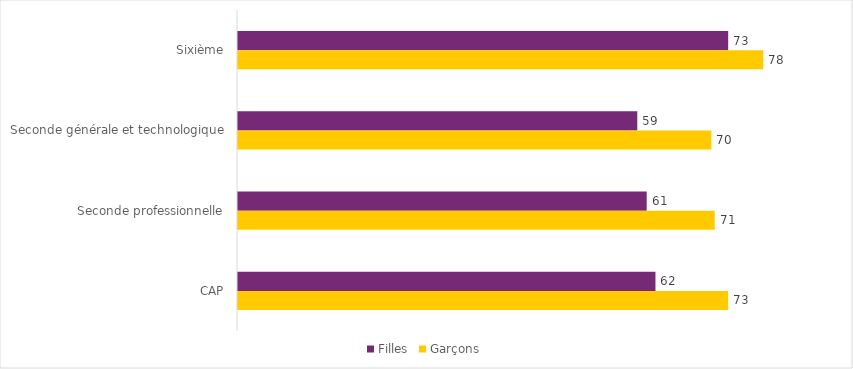
| Category | Filles | Garçons |
|---|---|---|
| Sixième | 72.8 | 78 |
| Seconde générale et technologique | 59.3 | 70.3 |
| Seconde professionnelle | 60.7 | 70.8 |
| CAP | 62 | 72.8 |